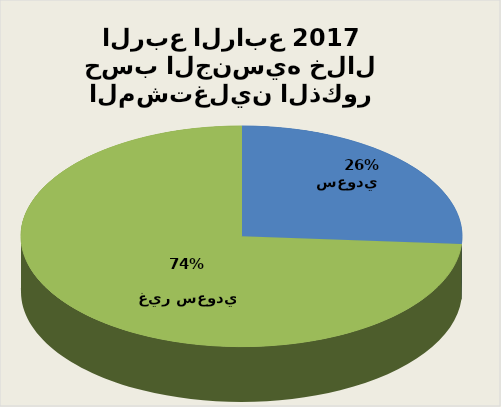
| Category | Series 0 |
|---|---|
| سعودي        | 1577974 |
| غير سعودي         | 4466397 |